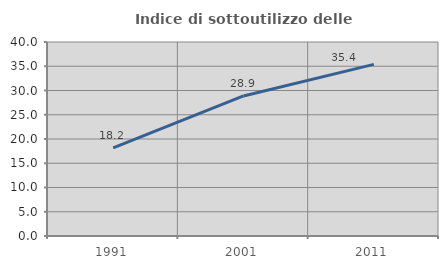
| Category | Indice di sottoutilizzo delle abitazioni  |
|---|---|
| 1991.0 | 18.191 |
| 2001.0 | 28.873 |
| 2011.0 | 35.387 |